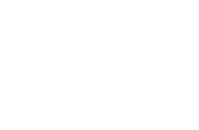
| Category | 0 |
|---|---|
| 0.0 | 0 |
| 0.0 | 0 |
| 0.0 | 0 |
| 0.0 | 0 |
| 0.0 | 0 |
| 0.0 | 0 |